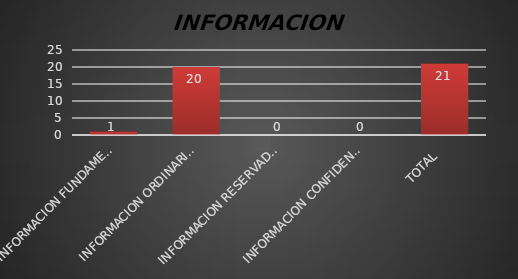
| Category | Series 1 |
|---|---|
| INFORMACION FUNDAMENTAL  | 1 |
| INFORMACION ORDINARIA  | 20 |
| INFORMACION RESERVADA  | 0 |
| INFORMACION CONFIDENCIAL  | 0 |
| TOTAL  | 21 |